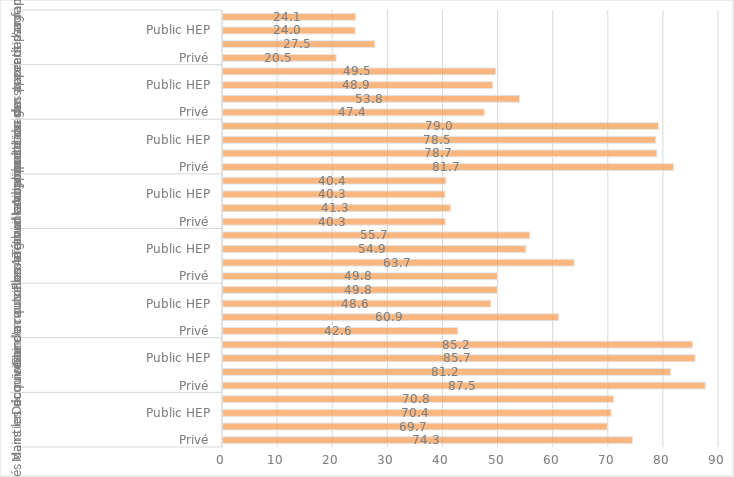
| Category | Oui |
|---|---|
| 0 | 74.29 |
| 1 | 69.73 |
| 2 | 70.42 |
| 3 | 70.84 |
| 4 | 87.51 |
| 5 | 81.18 |
| 6 | 85.67 |
| 7 | 85.18 |
| 8 | 42.59 |
| 9 | 60.89 |
| 10 | 48.59 |
| 11 | 49.79 |
| 12 | 49.81 |
| 13 | 63.69 |
| 14 | 54.94 |
| 15 | 55.67 |
| 16 | 40.3 |
| 17 | 41.25 |
| 18 | 40.28 |
| 19 | 40.44 |
| 20 | 81.73 |
| 21 | 78.73 |
| 22 | 78.52 |
| 23 | 79 |
| 24 | 47.4 |
| 25 | 53.8 |
| 26 | 48.91 |
| 27 | 49.51 |
| 28 | 20.53 |
| 29 | 27.5 |
| 30 | 23.97 |
| 31 | 24.08 |